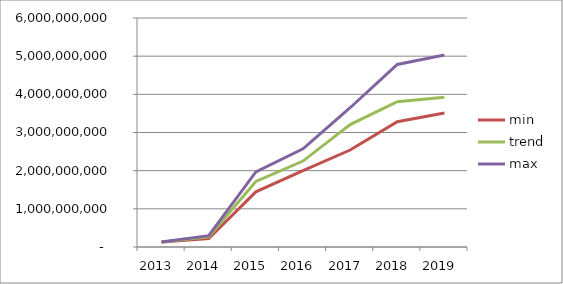
| Category |  min  |  trend  |  max  |
|---|---|---|---|
| 2013.0 | 129869763.53 | 129869763.53 | 129869763.53 |
| 2014.0 | 224146378.05 | 268707213.664 | 296790442.727 |
| 2015.0 | 1444592832.688 | 1716549909.883 | 1969931451.928 |
| 2016.0 | 2001226012.633 | 2251527425.337 | 2571763352.593 |
| 2017.0 | 2540547209.342 | 3207833923.086 | 3648716372.031 |
| 2018.0 | 3284189085.695 | 3807772122.097 | 4782536075.758 |
| 2019.0 | 3510634395.574 | 3920631424.115 | 5032828345.426 |